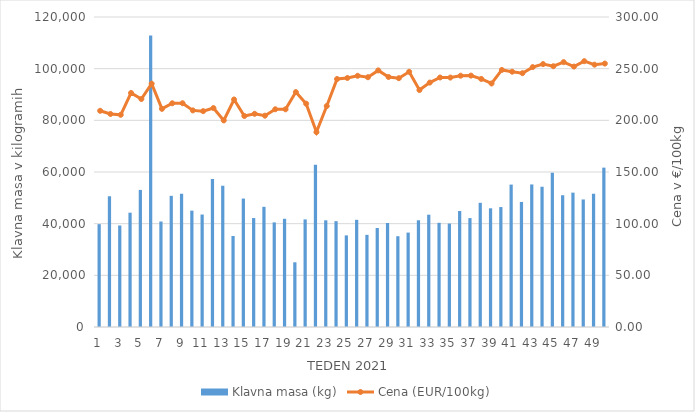
| Category | Klavna masa (kg) |
|---|---|
| 1.0 | 39814 |
| 2.0 | 50603 |
| 3.0 | 39295 |
| 4.0 | 44250 |
| 5.0 | 53061 |
| 6.0 | 112816 |
| 7.0 | 40829 |
| 8.0 | 50775 |
| 9.0 | 51535 |
| 10.0 | 45040 |
| 11.0 | 43536 |
| 12.0 | 57246 |
| 13.0 | 54680 |
| 14.0 | 35237 |
| 15.0 | 49721 |
| 16.0 | 42177 |
| 17.0 | 46525 |
| 18.0 | 40491 |
| 19.0 | 41888 |
| 20.0 | 25048 |
| 21.0 | 41651 |
| 22.0 | 62774 |
| 23.0 | 41297 |
| 24.0 | 40971 |
| 25.0 | 35465 |
| 26.0 | 41489 |
| 27.0 | 35675 |
| 28.0 | 38316 |
| 29.0 | 40265 |
| 30.0 | 35146 |
| 31.0 | 36548 |
| 32.0 | 41314 |
| 33.0 | 43471 |
| 34.0 | 40333 |
| 35.0 | 40041 |
| 36.0 | 44895 |
| 37.0 | 42158 |
| 38.0 | 48077 |
| 39.0 | 45950 |
| 40.0 | 46433 |
| 41.0 | 55121 |
| 42.0 | 48414 |
| 43.0 | 55179 |
| 44.0 | 54294 |
| 45.0 | 59707 |
| 46.0 | 51007 |
| 47.0 | 52010 |
| 48.0 | 49369 |
| 49.0 | 51594 |
| 50.0 | 61693 |